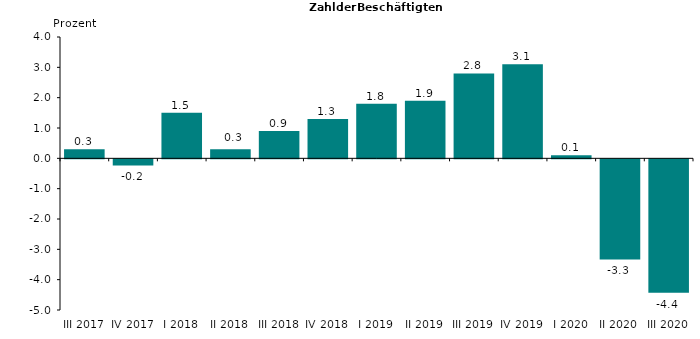
| Category | 0,3 |
|---|---|
| III 2017 | 0.3 |
| IV 2017 | -0.2 |
| I 2018 | 1.5 |
| II 2018 | 0.3 |
| III 2018 | 0.9 |
| IV 2018 | 1.3 |
| I 2019 | 1.8 |
| II 2019 | 1.9 |
| III 2019 | 2.8 |
| IV 2019 | 3.1 |
| I 2020 | 0.1 |
| II 2020 | -3.3 |
| III 2020 | -4.4 |